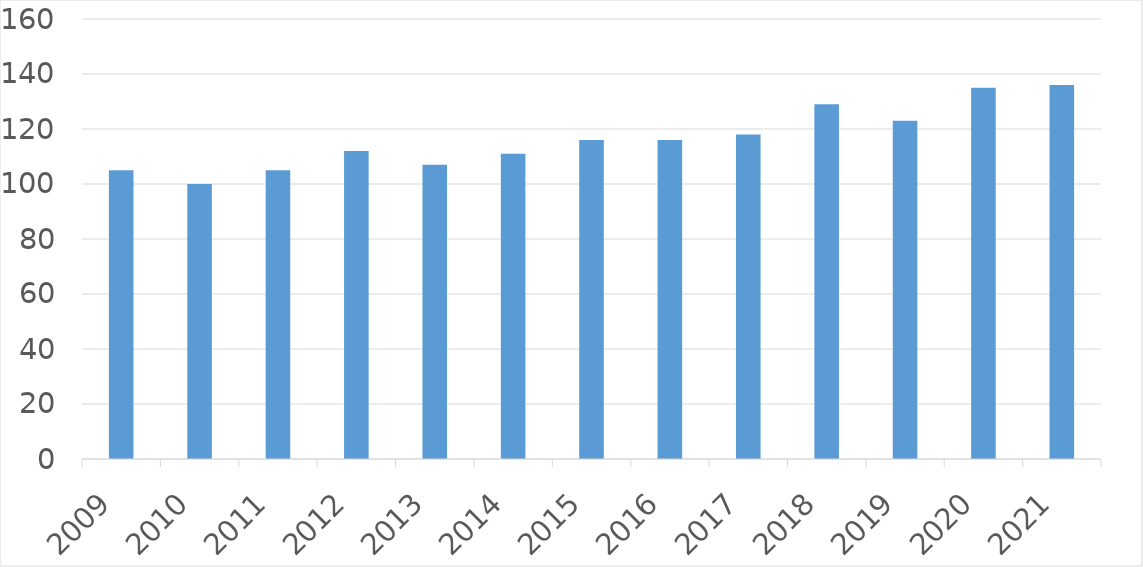
| Category | Series 0 |
|---|---|
| 2009 | 105 |
| 2010 | 100 |
| 2011 | 105 |
| 2012 | 112 |
| 2013 | 107 |
| 2014 | 111 |
| 2015 | 116 |
| 2016 | 116 |
| 2017 | 118 |
| 2018 | 129 |
| 2019 | 123 |
| 2020 | 135 |
| 2021 | 136 |